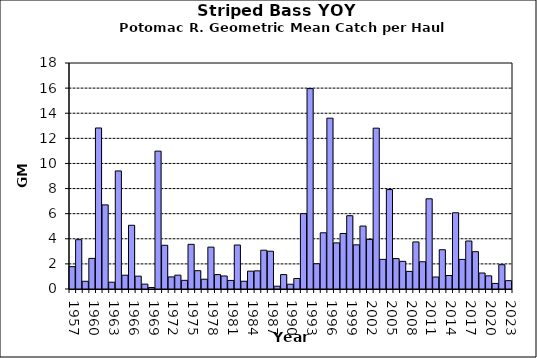
| Category | Series 0 |
|---|---|
| 1957.0 | 1.781 |
| 1958.0 | 3.928 |
| 1959.0 | 0.614 |
| 1960.0 | 2.439 |
| 1961.0 | 12.824 |
| 1962.0 | 6.698 |
| 1963.0 | 0.543 |
| 1964.0 | 9.402 |
| 1965.0 | 1.098 |
| 1966.0 | 5.075 |
| 1967.0 | 1.023 |
| 1968.0 | 0.389 |
| 1969.0 | 0.121 |
| 1970.0 | 10.981 |
| 1971.0 | 3.481 |
| 1972.0 | 0.964 |
| 1973.0 | 1.103 |
| 1974.0 | 0.69 |
| 1975.0 | 3.557 |
| 1976.0 | 1.457 |
| 1977.0 | 0.78 |
| 1978.0 | 3.334 |
| 1979.0 | 1.148 |
| 1980.0 | 1.037 |
| 1981.0 | 0.683 |
| 1982.0 | 3.504 |
| 1983.0 | 0.617 |
| 1984.0 | 1.422 |
| 1985.0 | 1.446 |
| 1986.0 | 3.089 |
| 1987.0 | 3.009 |
| 1988.0 | 0.222 |
| 1989.0 | 1.149 |
| 1990.0 | 0.38 |
| 1991.0 | 0.837 |
| 1992.0 | 6.002 |
| 1993.0 | 15.96 |
| 1994.0 | 2.011 |
| 1995.0 | 4.477 |
| 1996.0 | 13.605 |
| 1997.0 | 3.673 |
| 1998.0 | 4.421 |
| 1999.0 | 5.838 |
| 2000.0 | 3.519 |
| 2001.0 | 5.012 |
| 2002.0 | 3.95 |
| 2003.0 | 12.81 |
| 2004.0 | 2.36 |
| 2005.0 | 7.92 |
| 2006.0 | 2.421 |
| 2007.0 | 2.202 |
| 2008.0 | 1.402 |
| 2009.0 | 3.749 |
| 2010.0 | 2.169 |
| 2011.0 | 7.184 |
| 2012.0 | 0.955 |
| 2013.0 | 3.127 |
| 2014.0 | 1.073 |
| 2015.0 | 6.072 |
| 2016.0 | 2.356 |
| 2017.0 | 3.822 |
| 2018.0 | 2.973 |
| 2019.0 | 1.274 |
| 2020.0 | 1.05 |
| 2021.0 | 0.444 |
| 2022.0 | 1.936 |
| 2023.0 | 0.665 |